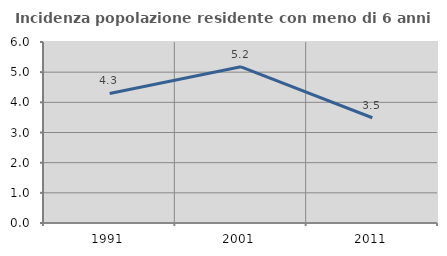
| Category | Incidenza popolazione residente con meno di 6 anni |
|---|---|
| 1991.0 | 4.295 |
| 2001.0 | 5.176 |
| 2011.0 | 3.488 |